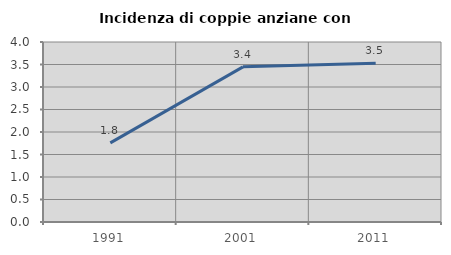
| Category | Incidenza di coppie anziane con figli |
|---|---|
| 1991.0 | 1.759 |
| 2001.0 | 3.448 |
| 2011.0 | 3.529 |